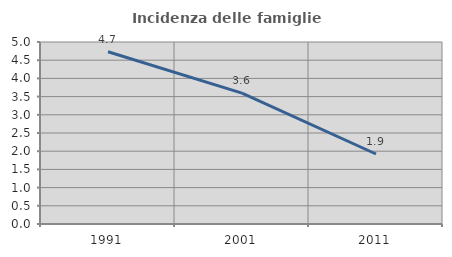
| Category | Incidenza delle famiglie numerose |
|---|---|
| 1991.0 | 4.733 |
| 2001.0 | 3.596 |
| 2011.0 | 1.923 |